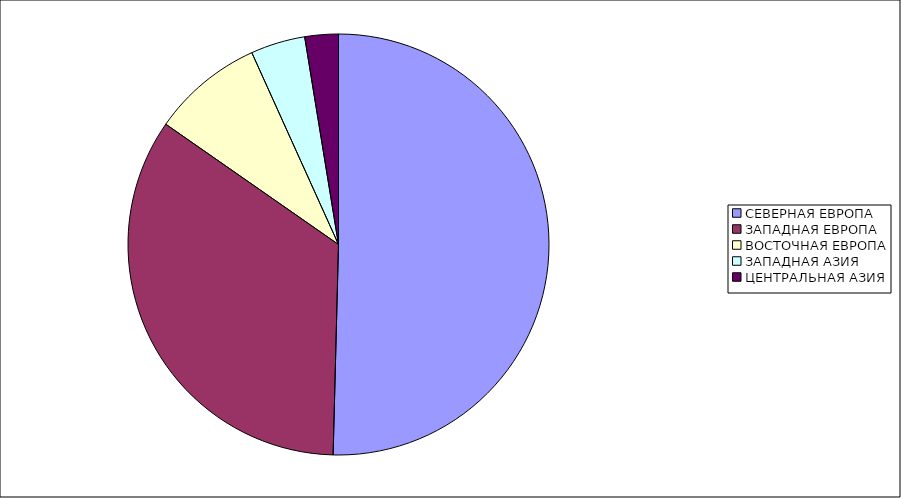
| Category | Оборот |
|---|---|
| СЕВЕРНАЯ ЕВРОПА | 50.407 |
| ЗАПАДНАЯ ЕВРОПА | 34.277 |
| ВОСТОЧНАЯ ЕВРОПА | 8.561 |
| ЗАПАДНАЯ АЗИЯ | 4.183 |
| ЦЕНТРАЛЬНАЯ АЗИЯ | 2.572 |